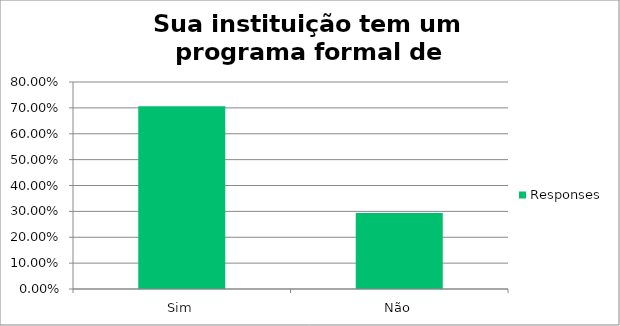
| Category | Responses |
|---|---|
| Sim | 0.706 |
| Não | 0.294 |